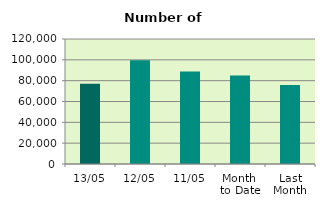
| Category | Series 0 |
|---|---|
| 13/05 | 77006 |
| 12/05 | 99664 |
| 11/05 | 88712 |
| Month 
to Date | 84973.333 |
| Last
Month | 75814.526 |